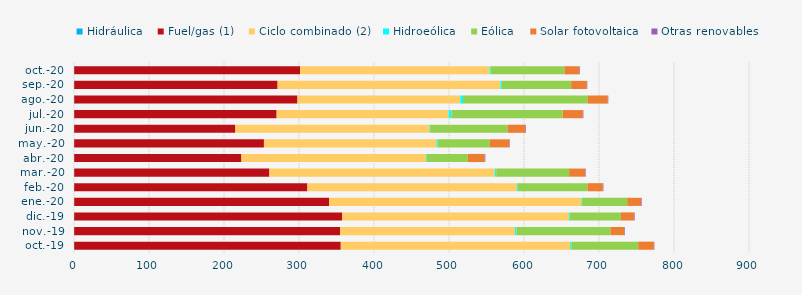
| Category | Hidráulica | Fuel/gas (1) | Ciclo combinado (2) | Hidroeólica | Eólica | Solar fotovoltaica | Otras renovables |
|---|---|---|---|---|---|---|---|
| oct.-19 | 0.298 | 355.375 | 305.832 | 1.583 | 89.263 | 20.851 | 0.577 |
| nov.-19 | 0.297 | 354.637 | 233.081 | 2.097 | 125.116 | 18.324 | 0.873 |
| dic.-19 | 0.299 | 357.248 | 301.9 | 1.16 | 68.726 | 17.279 | 0.905 |
| ene.-20 | 0.304 | 339.847 | 336.412 | 0.825 | 60.204 | 18.499 | 0.876 |
| feb.-20 | 0.268 | 310.921 | 279.078 | 1.339 | 93.155 | 20.258 | 0.846 |
| mar.-20 | 0.299 | 260.141 | 300.755 | 1.824 | 97.166 | 21.187 | 0.822 |
| abr.-20 | 0.288 | 222.936 | 246.048 | 0.991 | 54.729 | 22.608 | 0.84 |
| may.-20 | 0.288 | 252.957 | 229.929 | 1.443 | 69.749 | 25.983 | 0.706 |
| jun.-20 | 0.272 | 214.832 | 258.953 | 0.743 | 103.362 | 23.718 | 0.785 |
| jul.-20 | 0.29 | 269.887 | 229.388 | 3.652 | 148.256 | 26.994 | 0.694 |
| ago.-20 | 0.294 | 297.661 | 217.205 | 3.576 | 166.405 | 26.574 | 0.691 |
| sep.-20 | 0.292 | 271.163 | 297.078 | 1.912 | 92.425 | 20.864 | 0.65 |
| oct.-20 | 0.299 | 301.034 | 252.831 | 1.457 | 98.27 | 19.858 | 0.783 |